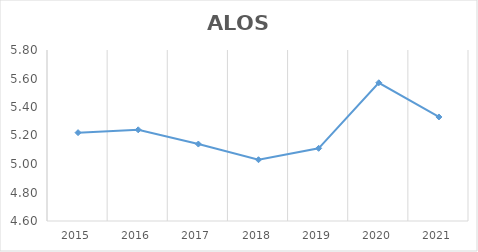
| Category | ALOS |
|---|---|
| 2015.0 | 5.22 |
| 2016.0 | 5.24 |
| 2017.0 | 5.14 |
| 2018.0 | 5.03 |
| 2019.0 | 5.11 |
| 2020.0 | 5.57 |
| 2021.0 | 5.33 |